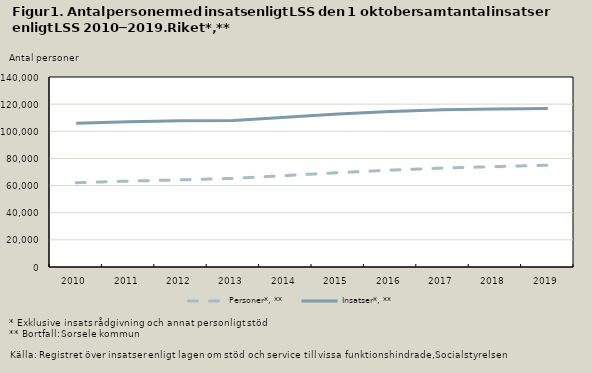
| Category | Personer*, ** | Insatser*, ** |
|---|---|---|
| 2010.0 | 62100 | 106000 |
| 2011.0 | 63300 | 107100 |
| 2012.0 | 64200 | 107700 |
| 2013.0 | 65300 | 107900 |
| 2014.0 | 67400 | 110300 |
| 2015.0 | 69500 | 112800 |
| 2016.0 | 71400 | 114500 |
| 2017.0 | 72900 | 115800 |
| 2018.0 | 74000 | 116500 |
| 2019.0 | 75000 | 116700 |